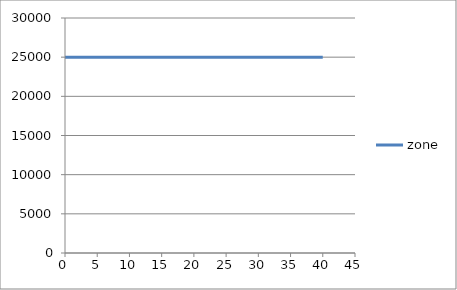
| Category | zone |
|---|---|
| 0.0 | 25000 |
| 0.4 | 25000 |
| 0.8 | 25000 |
| 1.2000000000000002 | 25000 |
| 1.6 | 25000 |
| 2.0 | 25000 |
| 2.4 | 25000 |
| 2.8 | 25000 |
| 3.1999999999999997 | 25000 |
| 3.5999999999999996 | 25000 |
| 3.9999999999999996 | 25000 |
| 4.3999999999999995 | 25000 |
| 4.8 | 25000 |
| 5.2 | 25000 |
| 5.6000000000000005 | 25000 |
| 6.000000000000001 | 25000 |
| 6.400000000000001 | 25000 |
| 6.800000000000002 | 25000 |
| 7.200000000000002 | 25000 |
| 7.600000000000002 | 25000 |
| 8.000000000000002 | 25000 |
| 8.400000000000002 | 25000 |
| 8.800000000000002 | 25000 |
| 9.200000000000003 | 25000 |
| 9.600000000000003 | 25000 |
| 10.000000000000004 | 25000 |
| 10.400000000000004 | 25000 |
| 10.800000000000004 | 25000 |
| 11.200000000000005 | 25000 |
| 11.600000000000005 | 25000 |
| 12.000000000000005 | 25000 |
| 12.400000000000006 | 25000 |
| 12.800000000000006 | 25000 |
| 13.200000000000006 | 25000 |
| 13.600000000000007 | 25000 |
| 14.000000000000007 | 25000 |
| 14.400000000000007 | 25000 |
| 14.800000000000008 | 25000 |
| 15.200000000000008 | 25000 |
| 15.600000000000009 | 25000 |
| 16.000000000000007 | 25000 |
| 16.400000000000006 | 25000 |
| 16.800000000000004 | 25000 |
| 17.200000000000003 | 25000 |
| 17.6 | 25000 |
| 18.0 | 25000 |
| 18.4 | 25000 |
| 18.799999999999997 | 25000 |
| 19.199999999999996 | 25000 |
| 19.599999999999994 | 25000 |
| 19.999999999999993 | 25000 |
| 20.39999999999999 | 25000 |
| 20.79999999999999 | 25000 |
| 21.19999999999999 | 25000 |
| 21.599999999999987 | 25000 |
| 21.999999999999986 | 25000 |
| 22.399999999999984 | 25000 |
| 22.799999999999983 | 25000 |
| 23.19999999999998 | 25000 |
| 23.59999999999998 | 25000 |
| 23.99999999999998 | 25000 |
| 24.399999999999977 | 25000 |
| 24.799999999999976 | 25000 |
| 25.199999999999974 | 25000 |
| 25.599999999999973 | 25000 |
| 25.99999999999997 | 25000 |
| 26.39999999999997 | 25000 |
| 26.79999999999997 | 25000 |
| 27.199999999999967 | 25000 |
| 27.599999999999966 | 25000 |
| 27.999999999999964 | 25000 |
| 28.399999999999963 | 25000 |
| 28.79999999999996 | 25000 |
| 29.19999999999996 | 25000 |
| 29.59999999999996 | 25000 |
| 29.999999999999957 | 25000 |
| 30.399999999999956 | 25000 |
| 30.799999999999955 | 25000 |
| 31.199999999999953 | 25000 |
| 31.59999999999995 | 25000 |
| 31.99999999999995 | 25000 |
| 32.39999999999995 | 25000 |
| 32.79999999999995 | 25000 |
| 33.199999999999946 | 25000 |
| 33.599999999999945 | 25000 |
| 33.99999999999994 | 25000 |
| 34.39999999999994 | 25000 |
| 34.79999999999994 | 25000 |
| 35.19999999999994 | 25000 |
| 35.59999999999994 | 25000 |
| 35.999999999999936 | 25000 |
| 36.399999999999935 | 25000 |
| 36.79999999999993 | 25000 |
| 37.19999999999993 | 25000 |
| 37.59999999999993 | 25000 |
| 37.99999999999993 | 25000 |
| 38.39999999999993 | 25000 |
| 38.799999999999926 | 25000 |
| 39.199999999999925 | 25000 |
| 39.59999999999992 | 25000 |
| 39.99999999999992 | 25000 |